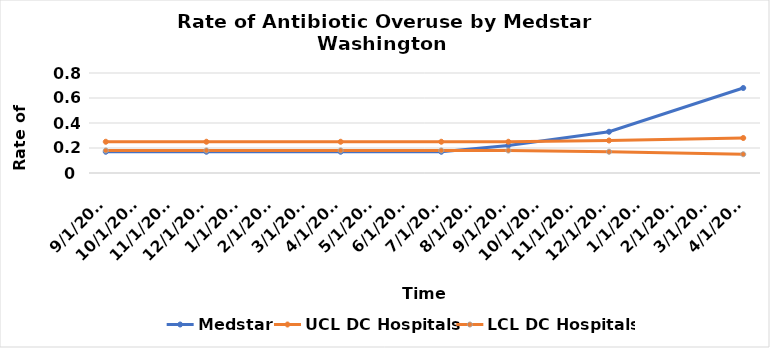
| Category | Medstar | UCL DC Hospitals | LCL DC Hospitals |
|---|---|---|---|
| 9/30/13 | 0.17 | 0.25 | 0.18 |
| 12/30/13 | 0.17 | 0.25 | 0.18 |
| 4/1/14 | 0.17 | 0.25 | 0.18 |
| 7/2/14 | 0.17 | 0.25 | 0.18 |
| 9/30/14 | 0.22 | 0.25 | 0.18 |
| 12/30/14 | 0.33 | 0.26 | 0.17 |
| 4/1/15 | 0.68 | 0.28 | 0.15 |